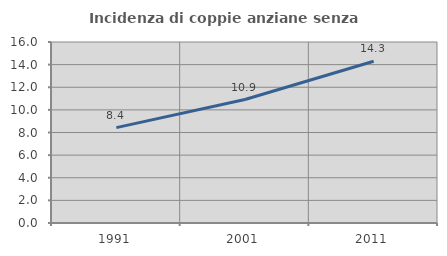
| Category | Incidenza di coppie anziane senza figli  |
|---|---|
| 1991.0 | 8.428 |
| 2001.0 | 10.917 |
| 2011.0 | 14.3 |